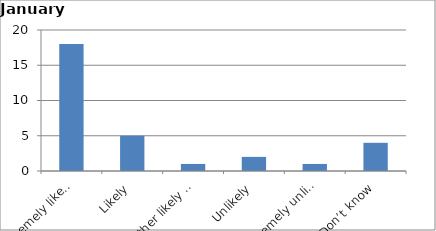
| Category | Series 0 |
|---|---|
| Extremely likely | 18 |
| Likely | 5 |
| Neither likely nor unlikely | 1 |
| Unlikely | 2 |
| Extremely unlikely | 1 |
| Don’t know | 4 |